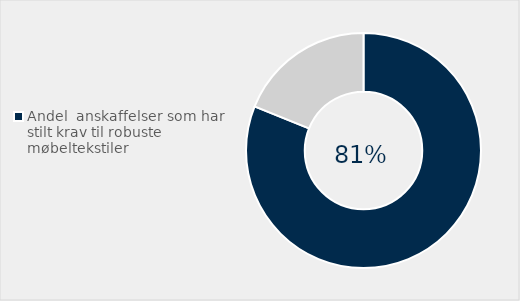
| Category | Series 0 |
|---|---|
| Andel  anskaffelser som har stilt krav til robuste møbeltekstiler | 0.811 |
| Ikke stilt krav til robuste møbeltekstiler | 0.189 |